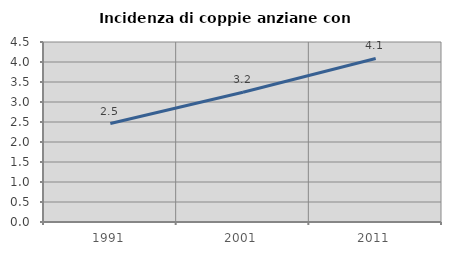
| Category | Incidenza di coppie anziane con figli |
|---|---|
| 1991.0 | 2.461 |
| 2001.0 | 3.244 |
| 2011.0 | 4.089 |